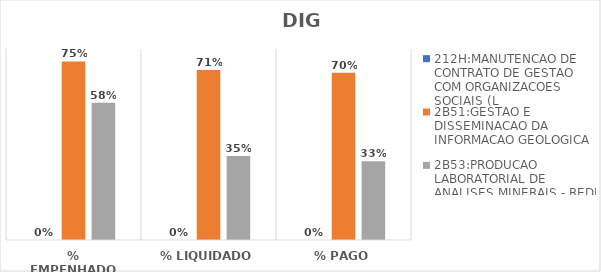
| Category | 212H:MANUTENCAO DE CONTRATO DE GESTAO COM ORGANIZACOES SOCIAIS (L | 2B51:GESTAO E DISSEMINACAO DA INFORMACAO GEOLOGICA | 2B53:PRODUCAO LABORATORIAL DE ANALISES MINERAIS - REDE LAMIN |
|---|---|---|---|
| % EMPENHADO | 0 | 0.748 | 0.575 |
| % LIQUIDADO | 0 | 0.712 | 0.352 |
| % PAGO | 0 | 0.7 | 0.33 |